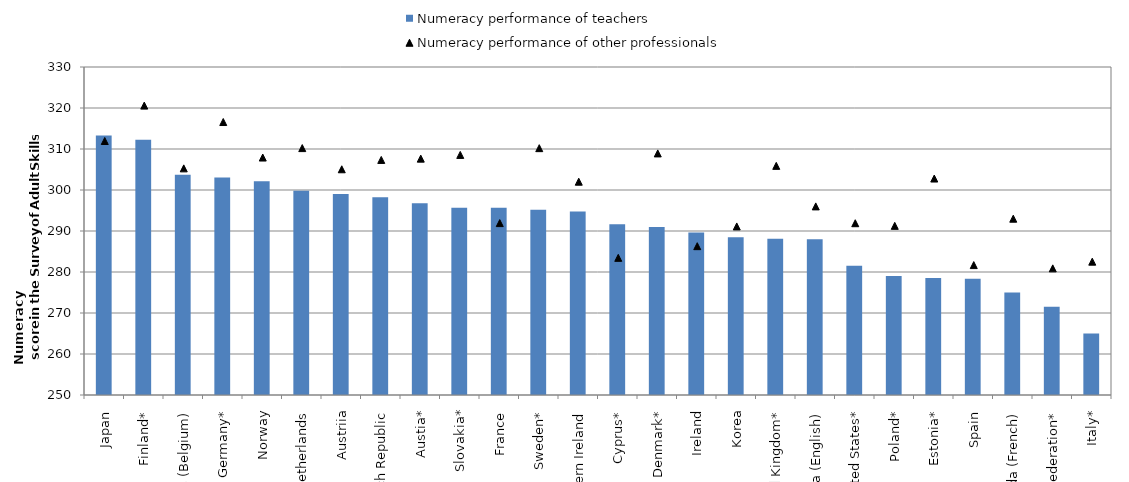
| Category | Numeracy performance of teachers |
|---|---|
| Japan | 313.31 |
| Finland* | 312.259 |
| Flanders (Belgium) | 303.694 |
| Germany* | 303.026 |
| Norway | 302.135 |
| Netherlands | 299.818 |
| Austriia | 299.05 |
| Czech Republic | 298.244 |
| Austia* | 296.739 |
| Slovakia* | 295.653 |
| France | 295.648 |
| Sweden* | 295.171 |
| Northern Ireland | 294.73 |
| Cyprus* | 291.673 |
| Denmark* | 290.948 |
| Ireland | 289.634 |
| Korea | 288.474 |
| United Kingdom* | 288.115 |
| Canada (English) | 288 |
| United States* | 281.537 |
| Poland* | 279.054 |
| Estonia* | 278.512 |
| Spain | 278.381 |
| Canada (French) | 275 |
| Russian Federation* | 271.535 |
| Italy* | 264.971 |